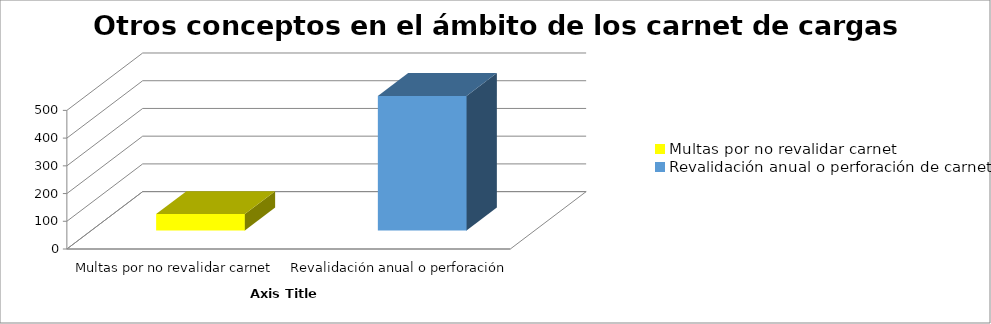
| Category | Series 0 |
|---|---|
| Multas por no revalidar carnet | 59 |
| Revalidación anual o perforación de carnet | 485 |